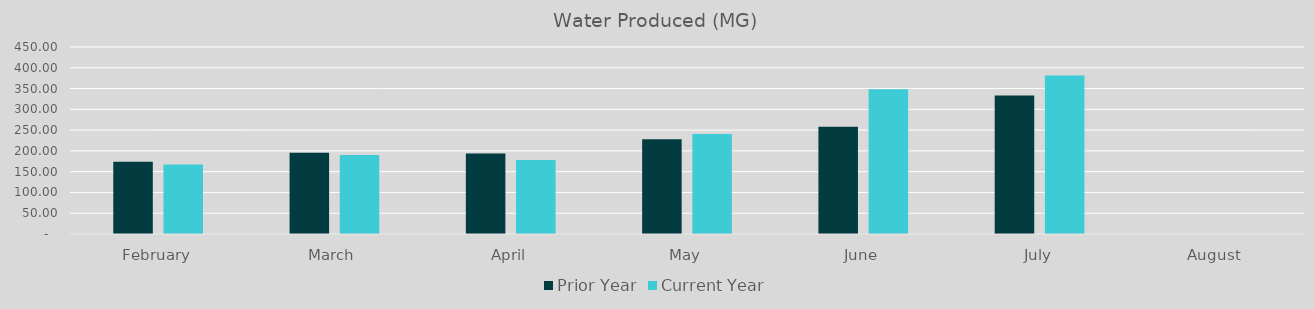
| Category | Prior Year | Current Year |
|---|---|---|
| February | 173.847 | 167.532 |
| March | 195.333 | 190.306 |
| April | 193.551 | 178.22 |
| May | 228.091 | 240.625 |
| June | 257.9 | 348.57 |
| July | 333.37 | 381.34 |
| August | 0 | 0 |